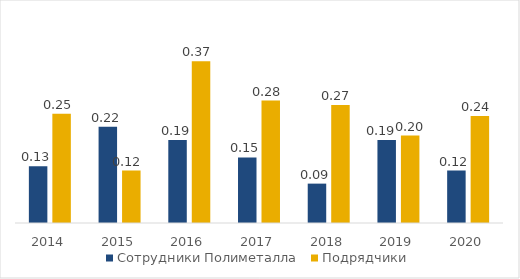
| Category | Сотрудники Полиметалла | Подрядчики |
|---|---|---|
| 2014.0 | 0.13 | 0.25 |
| 2015.0 | 0.22 | 0.12 |
| 2016.0 | 0.19 | 0.37 |
| 2017.0 | 0.15 | 0.28 |
| 2018.0 | 0.09 | 0.27 |
| 2019.0 | 0.19 | 0.2 |
| 2020.0 | 0.12 | 0.245 |